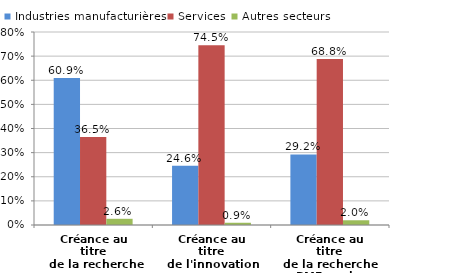
| Category | Industries manufacturières | Services | Autres secteurs |
|---|---|---|---|
| Créance au titre
 de la recherche | 0.609 | 0.365 | 0.026 |
| Créance au titre
de l'innovation | 0.246 | 0.745 | 0.009 |
| Créance au titre
de la recherche
PME seules | 0.292 | 0.688 | 0.02 |